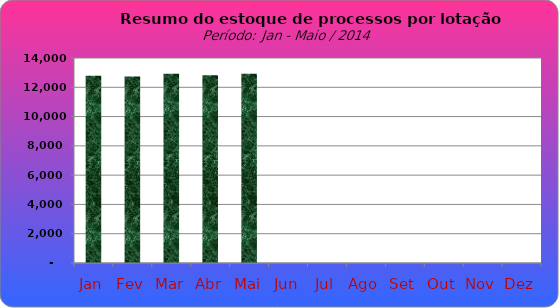
| Category | Series 0 |
|---|---|
| Jan | 12795 |
| Fev | 12744 |
| Mar | 12928 |
| Abr | 12816 |
| Mai | 12923 |
| Jun | 0 |
| Jul | 0 |
| Ago | 0 |
| Set | 0 |
| Out | 0 |
| Nov | 0 |
| Dez | 0 |